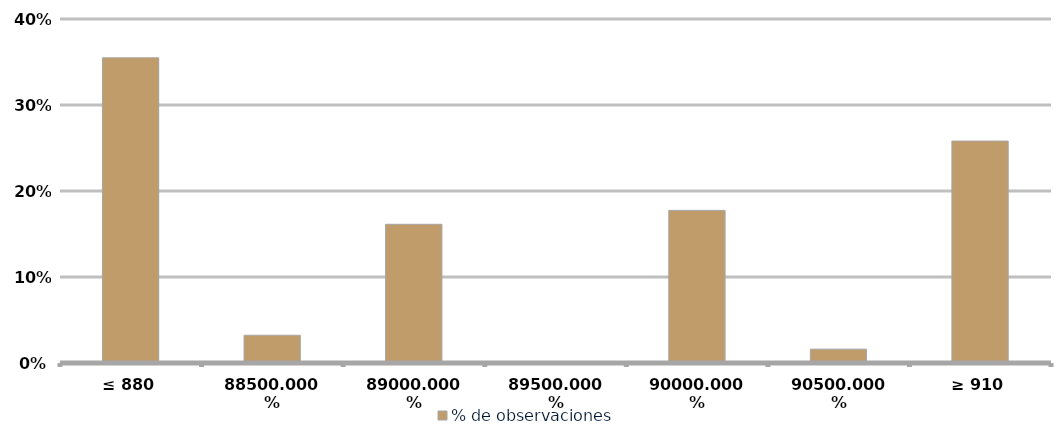
| Category | % de observaciones  |
|---|---|
| ≤ 880 | 0.355 |
| 885 | 0.032 |
| 890 | 0.161 |
| 895 | 0 |
| 900 | 0.177 |
| 905 | 0.016 |
| ≥ 910 | 0.258 |